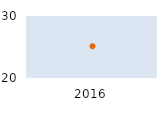
| Category | Max | OECD mean | Min |
|---|---|---|---|
| 2016.0 | 56.922 | 25.125 | 8.169 |